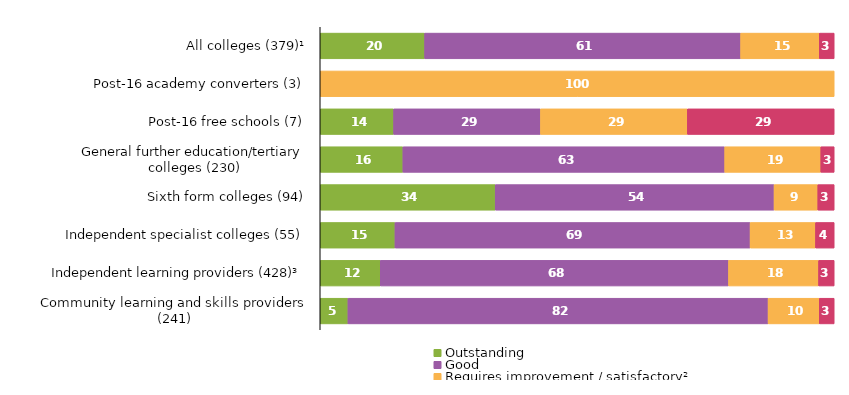
| Category | Outstanding | Good | Requires improvement / satisfactory² | Inadequate |
|---|---|---|---|---|
| All colleges (379)¹ | 20.317 | 61.478 | 15.303 | 2.902 |
| Post-16 academy converters (3) | 0 | 0 | 100 | 0 |
| Post-16 free schools (7) | 14.286 | 28.571 | 28.571 | 28.571 |
| General further education/tertiary colleges (230) | 16.087 | 62.609 | 18.696 | 2.609 |
| Sixth form colleges (94) | 34.043 | 54.255 | 8.511 | 3.191 |
| Independent specialist colleges (55) | 14.545 | 69.091 | 12.727 | 3.636 |
| Independent learning providers (428)³ | 11.682 | 67.757 | 17.523 | 3.037 |
| Community learning and skills providers (241) | 5.394 | 81.743 | 9.959 | 2.905 |